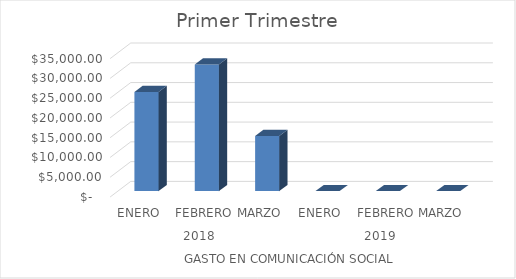
| Category | Series 0 |
|---|---|
| 0 | 25056 |
| 1 | 32016 |
| 2 | 13920 |
| 3 | 0 |
| 4 | 0 |
| 5 | 0 |